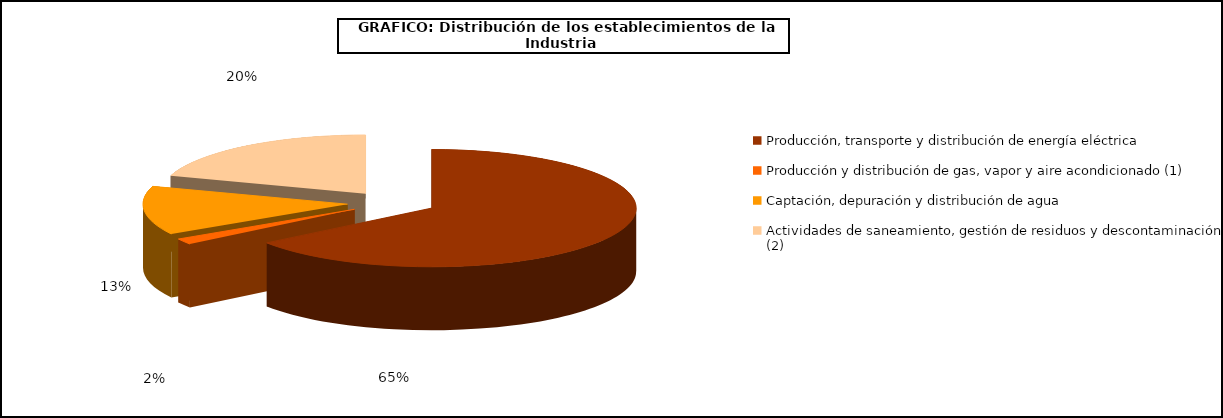
| Category | Series 0 |
|---|---|
| Producción, transporte y distribución de energía eléctrica | 17447 |
| Producción y distribución de gas, vapor y aire acondicionado (1) | 436 |
| Captación, depuración y distribución de agua | 3602 |
| Actividades de saneamiento, gestión de residuos y descontaminación (2) | 5397 |